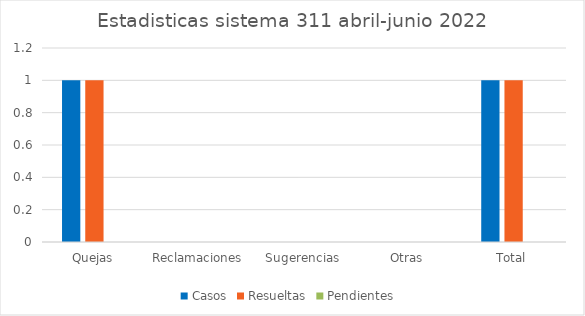
| Category | Casos | Resueltas | Pendientes  |
|---|---|---|---|
| Quejas | 1 | 1 | 0 |
| Reclamaciones | 0 | 0 | 0 |
| Sugerencias | 0 | 0 | 0 |
| Otras | 0 | 0 | 0 |
| Total | 1 | 1 | 0 |